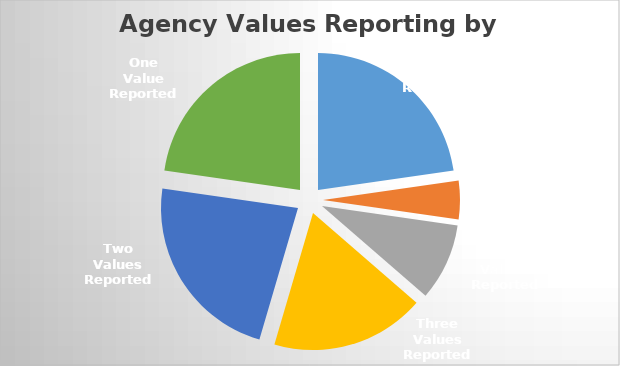
| Category | # staff reporting |
|---|---|
| Zero Values Reported | 5 |
| All Five Values Reported | 1 |
| Four Values Reported | 2 |
| Three Values Reported | 4 |
| Two Values Reported | 5 |
| One Value Reported | 5 |